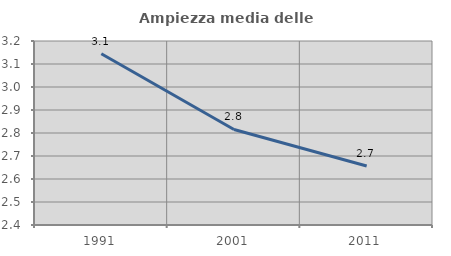
| Category | Ampiezza media delle famiglie |
|---|---|
| 1991.0 | 3.145 |
| 2001.0 | 2.815 |
| 2011.0 | 2.656 |